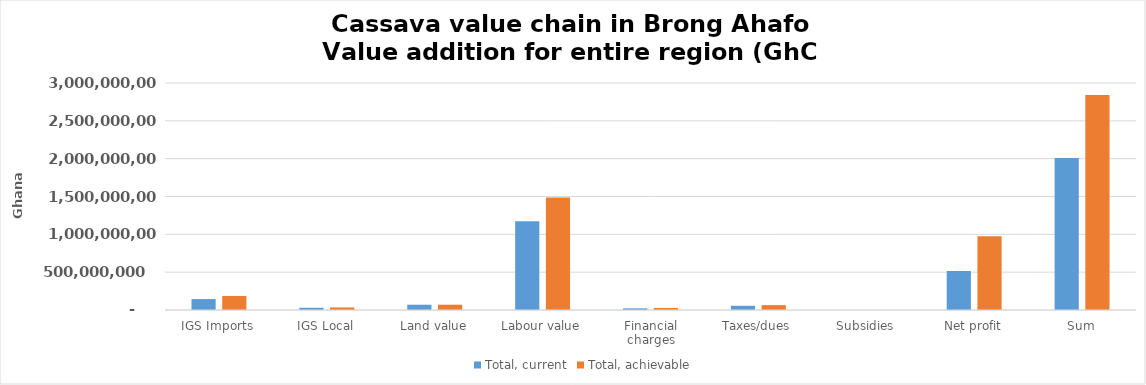
| Category | Total, current | Total, achievable |
|---|---|---|
| IGS Imports | 144492639.667 | 185659238.575 |
| IGS Local | 29584671.227 | 34096501.238 |
| Land value | 69779895.9 | 69779895.9 |
| Labour value | 1171629922.153 | 1485528417.556 |
| Financial charges | 21980207.12 | 27029506.602 |
| Taxes/dues | 55469320.637 | 64472724.008 |
| Subsidies | 0 | 0 |
| Net profit | 515622174.056 | 975705081.561 |
| Sum | 2008558830.76 | 2842271365.44 |